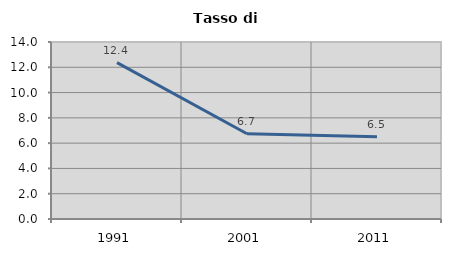
| Category | Tasso di disoccupazione   |
|---|---|
| 1991.0 | 12.371 |
| 2001.0 | 6.744 |
| 2011.0 | 6.503 |